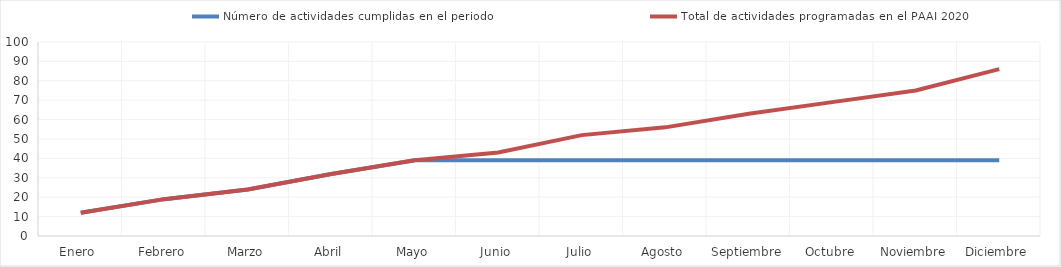
| Category | Número de actividades cumplidas en el periodo | Total de actividades programadas en el PAAI 2020 |
|---|---|---|
| Enero  | 12 | 12 |
| Febrero | 19 | 19 |
| Marzo | 24 | 24 |
| Abril | 32 | 32 |
| Mayo | 39 | 39 |
| Junio | 39 | 43 |
| Julio | 39 | 52 |
| Agosto | 39 | 56 |
| Septiembre | 39 | 63 |
| Octubre | 39 | 69 |
| Noviembre | 39 | 75 |
| Diciembre | 39 | 86 |